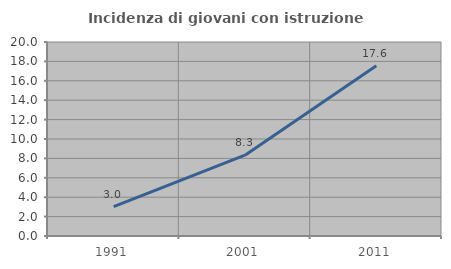
| Category | Incidenza di giovani con istruzione universitaria |
|---|---|
| 1991.0 | 3.03 |
| 2001.0 | 8.333 |
| 2011.0 | 17.557 |